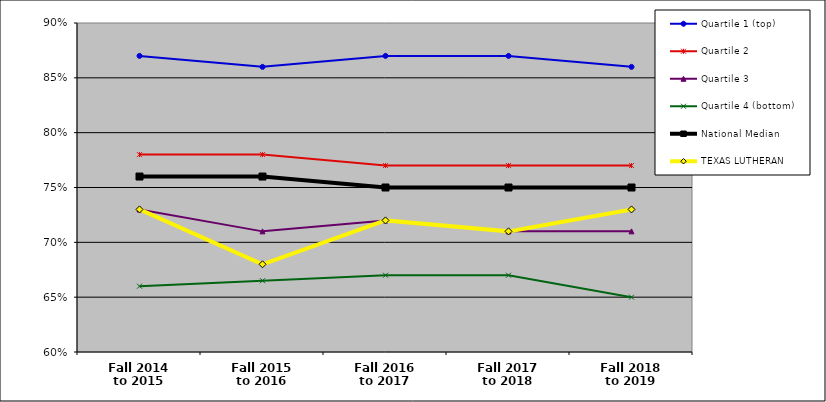
| Category | Quartile 1 (top) | Quartile 2 | Quartile 3 | Quartile 4 (bottom) | National Median | TEXAS LUTHERAN |
|---|---|---|---|---|---|---|
| Fall 2014
to 2015 | 0.87 | 0.78 | 0.73 | 0.66 | 0.76 | 0.73 |
| Fall 2015
to 2016 | 0.86 | 0.78 | 0.71 | 0.665 | 0.76 | 0.68 |
| Fall 2016
to 2017 | 0.87 | 0.77 | 0.72 | 0.67 | 0.75 | 0.72 |
| Fall 2017
to 2018 | 0.87 | 0.77 | 0.71 | 0.67 | 0.75 | 0.71 |
| Fall 2018
to 2019 | 0.86 | 0.77 | 0.71 | 0.65 | 0.75 | 0.73 |